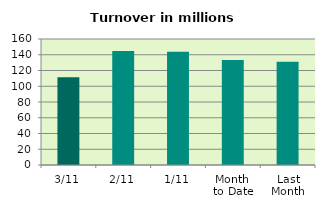
| Category | Series 0 |
|---|---|
| 3/11 | 111.532 |
| 2/11 | 144.838 |
| 1/11 | 143.712 |
| Month 
to Date | 133.361 |
| Last
Month | 131.017 |